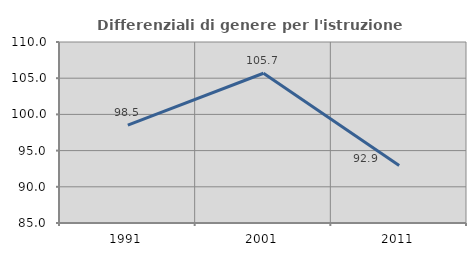
| Category | Differenziali di genere per l'istruzione superiore |
|---|---|
| 1991.0 | 98.507 |
| 2001.0 | 105.684 |
| 2011.0 | 92.942 |